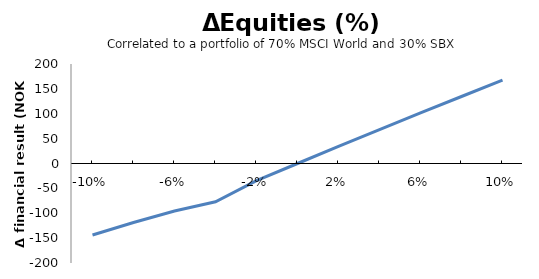
| Category | Series 0 |
|---|---|
| -0.1 | -143.666 |
| -0.08 | -118.51 |
| -0.06 | -95.47 |
| -0.039999999999999994 | -76.952 |
| -0.019999999999999993 | -34.483 |
| 0.0 | 0 |
| 0.02 | 34.198 |
| 0.04 | 67.932 |
| 0.06 | 101.54 |
| 0.08 | 134.653 |
| 0.1 | 167.491 |